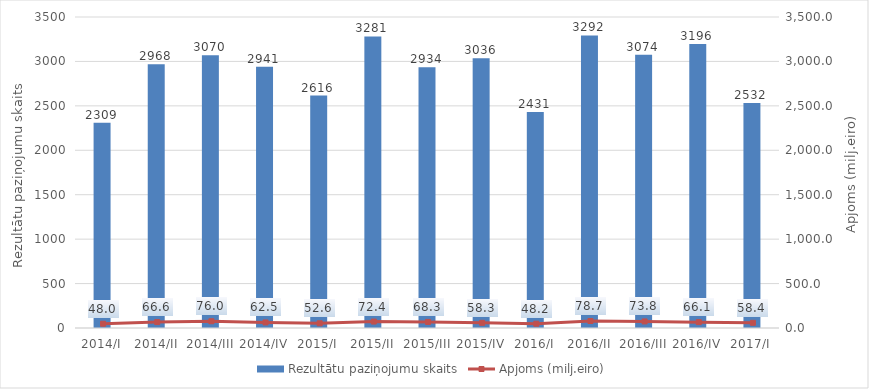
| Category | Rezultātu paziņojumu skaits |
|---|---|
| 2014/I | 2309 |
| 2014/II | 2968 |
| 2014/III | 3070 |
| 2014/IV | 2941 |
| 2015/I | 2616 |
| 2015/II | 3281 |
| 2015/III | 2934 |
| 2015/IV | 3036 |
| 2016/I | 2431 |
| 2016/II | 3292 |
| 2016/III | 3074 |
| 2016/IV | 3196 |
| 2017/I | 2532 |